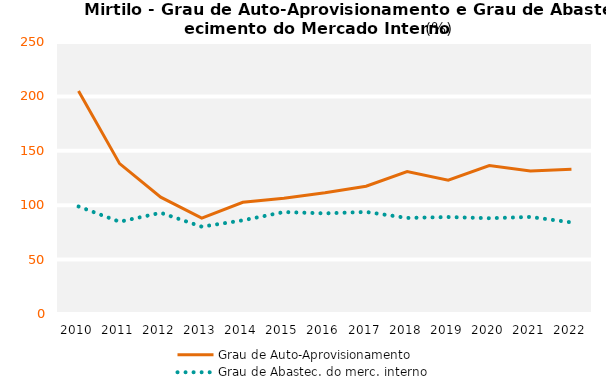
| Category | Grau de Auto-Aprovisionamento | Grau de Abastec. do merc. interno |
|---|---|---|
| 2010 | 205.016 | 98.819 |
| 2011 | 138.213 | 84.781 |
| 2012 | 107.398 | 93.027 |
| 2013 | 88.088 | 80.249 |
| 2014 | 102.645 | 86.11 |
| 2015 | 106.422 | 93.712 |
| 2016 | 111.359 | 92.485 |
| 2017 | 117.459 | 93.808 |
| 2018 | 130.969 | 88.282 |
| 2019 | 122.994 | 89.125 |
| 2020 | 136.484 | 88.042 |
| 2021 | 131.355 | 89.209 |
| 2022 | 133.074 | 84.194 |